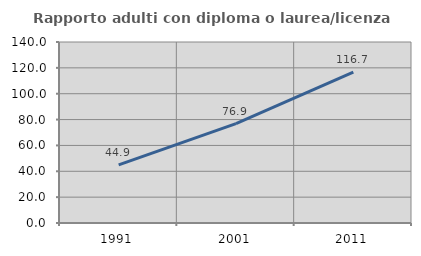
| Category | Rapporto adulti con diploma o laurea/licenza media  |
|---|---|
| 1991.0 | 44.907 |
| 2001.0 | 76.865 |
| 2011.0 | 116.65 |